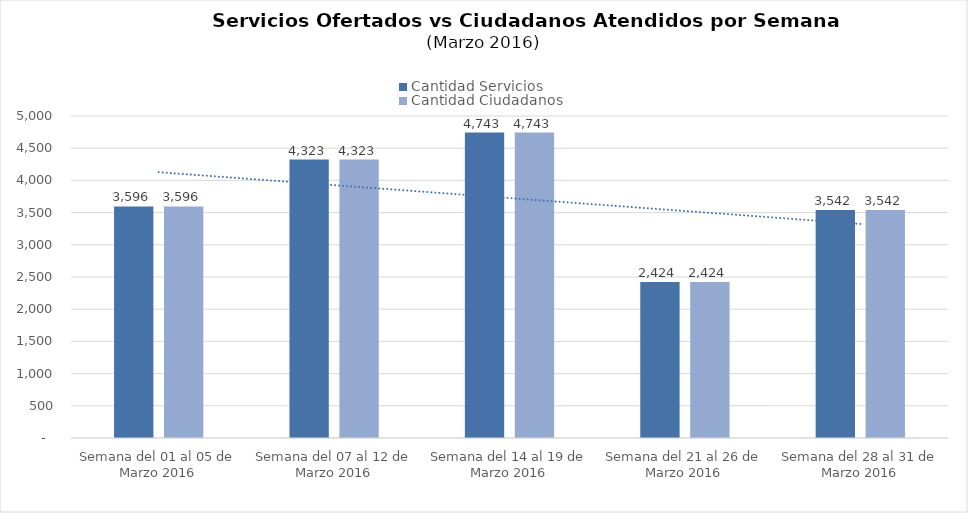
| Category | Cantidad Servicios | Cantidad Ciudadanos |
|---|---|---|
| Semana del 01 al 05 de Marzo 2016 | 3596 | 3596 |
| Semana del 07 al 12 de Marzo 2016 | 4323 | 4323 |
| Semana del 14 al 19 de Marzo 2016 | 4743 | 4743 |
| Semana del 21 al 26 de Marzo 2016 | 2424 | 2424 |
| Semana del 28 al 31 de Marzo 2016 | 3542 | 3542 |